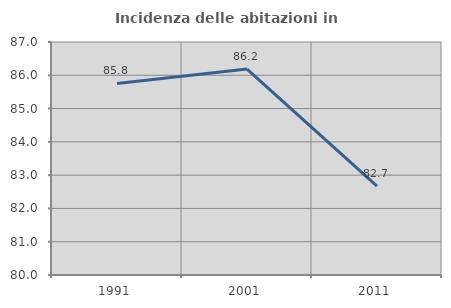
| Category | Incidenza delle abitazioni in proprietà  |
|---|---|
| 1991.0 | 85.754 |
| 2001.0 | 86.187 |
| 2011.0 | 82.673 |